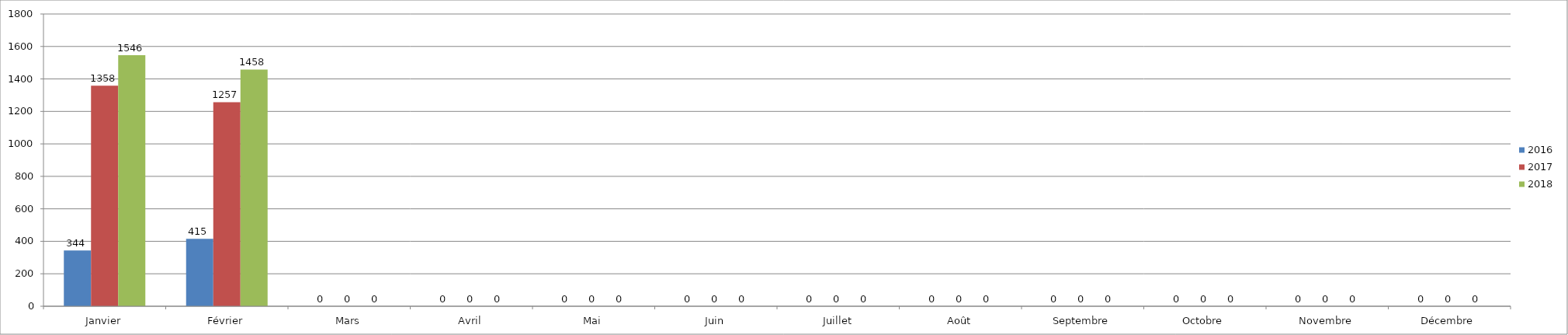
| Category | 2016 | 2017 | 2018 |
|---|---|---|---|
| Janvier | 344 | 1358 | 1546 |
| Février | 415 | 1257 | 1458 |
| Mars | 0 | 0 | 0 |
| Avril | 0 | 0 | 0 |
| Mai | 0 | 0 | 0 |
| Juin | 0 | 0 | 0 |
| Juillet | 0 | 0 | 0 |
| Août | 0 | 0 | 0 |
| Septembre | 0 | 0 | 0 |
| Octobre | 0 | 0 | 0 |
| Novembre | 0 | 0 | 0 |
| Décembre | 0 | 0 | 0 |